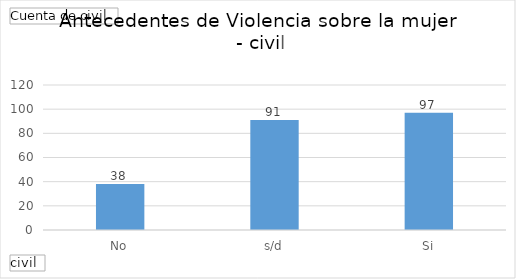
| Category | Total |
|---|---|
| No | 38 |
| s/d | 91 |
| Si | 97 |